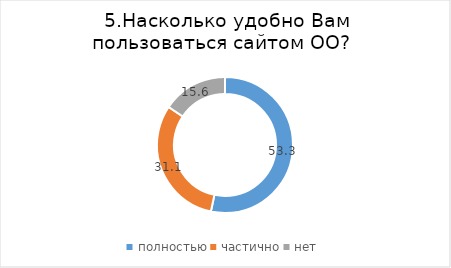
| Category | Series 0 |
|---|---|
| полностью | 53.333 |
| частично | 31.111 |
| нет | 15.556 |